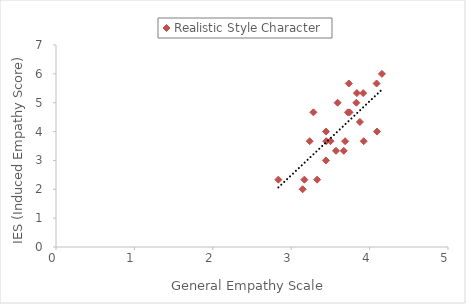
| Category | Realistic Style Character |
|---|---|
| 3.734722222222222 | 5.667 |
| 3.4472222222222224 | 3.667 |
| 3.1680555555555556 | 2.333 |
| 3.744444444444444 | 4.667 |
| 3.591666666666667 | 5 |
| 3.444444444444444 | 4 |
| 3.6875 | 3.667 |
| 3.8305555555555557 | 5 |
| 3.1458333333333335 | 2 |
| 3.8375 | 5.333 |
| 3.9250000000000003 | 3.667 |
| 4.156944444444444 | 6 |
| 3.5708333333333333 | 3.333 |
| 4.088888888888889 | 5.667 |
| 3.5013888888888887 | 3.667 |
| 3.2361111111111107 | 3.667 |
| 3.9180555555555556 | 5.333 |
| 3.443055555555556 | 3 |
| 3.7236111111111114 | 4.667 |
| 3.3305555555555557 | 2.333 |
| 3.283333333333333 | 4.667 |
| 4.094444444444445 | 4 |
| 3.670833333333334 | 3.333 |
| 3.8763888888888887 | 4.333 |
| 2.836111111111111 | 2.333 |